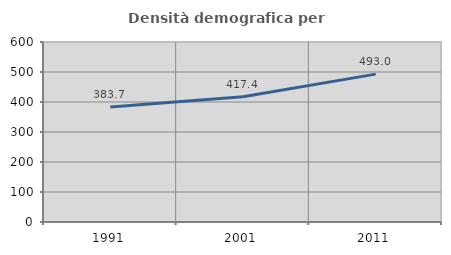
| Category | Densità demografica |
|---|---|
| 1991.0 | 383.688 |
| 2001.0 | 417.366 |
| 2011.0 | 492.976 |